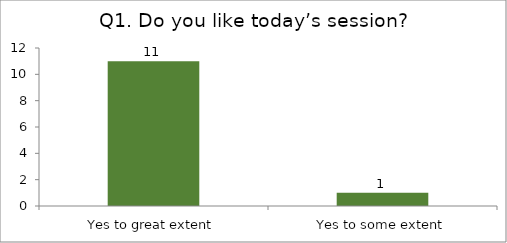
| Category | Q1. Do you like today’s session? |
|---|---|
| Yes to great extent | 11 |
| Yes to some extent | 1 |